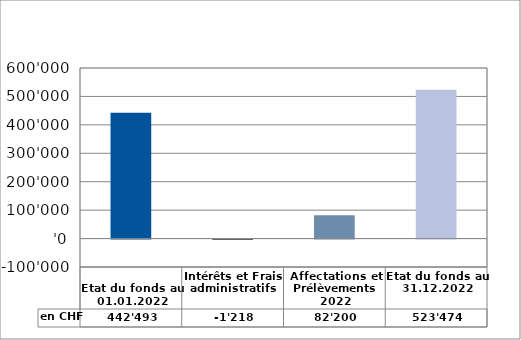
| Category | en CHF |
|---|---|
| 
Etat du fonds au 01.01.2022

 | 442492.55 |
| Intérêts et Frais administratifs | -1218.1 |
| Affectations et Prélèvements 2022 | 82199.65 |
| Etat du fonds au 31.12.2022 | 523474.1 |